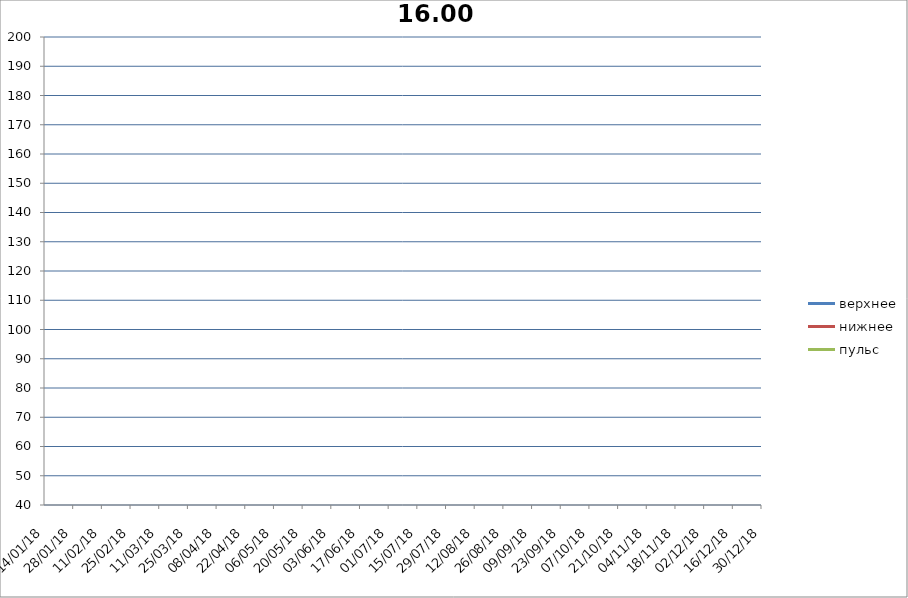
| Category | верхнее | нижнее | пульс |
|---|---|---|---|
| 2018-01-14 | 0 | 0 | 0 |
| 2018-01-28 | 0 | 0 | 0 |
| 2018-02-11 | 0 | 0 | 0 |
| 2018-02-25 | 0 | 0 | 0 |
| 2018-03-11 | 0 | 0 | 0 |
| 2018-03-25 | 0 | 0 | 0 |
| 2018-04-08 | 0 | 0 | 0 |
| 2018-04-22 | 0 | 0 | 0 |
| 2018-05-06 | 0 | 0 | 0 |
| 2018-05-20 | 0 | 0 | 0 |
| 2018-06-03 | 0 | 0 | 0 |
| 2018-06-17 | 0 | 0 | 0 |
| 2018-07-01 | 0 | 0 | 0 |
| 2018-07-15 | 0 | 0 | 0 |
| 2018-07-29 | 0 | 0 | 0 |
| 2018-08-12 | 0 | 0 | 0 |
| 2018-08-26 | 0 | 0 | 0 |
| 2018-09-09 | 0 | 0 | 0 |
| 2018-09-23 | 0 | 0 | 0 |
| 2018-10-07 | 0 | 0 | 0 |
| 2018-10-21 | 0 | 0 | 0 |
| 2018-11-04 | 0 | 0 | 0 |
| 2018-11-18 | 0 | 0 | 0 |
| 2018-12-02 | 0 | 0 | 0 |
| 2018-12-16 | 0 | 0 | 0 |
| 2018-12-30 | 0 | 0 | 0 |